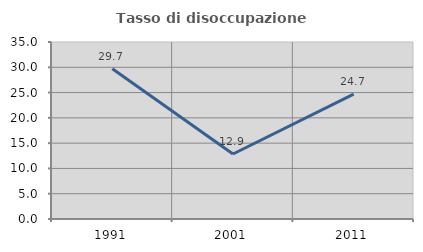
| Category | Tasso di disoccupazione giovanile  |
|---|---|
| 1991.0 | 29.719 |
| 2001.0 | 12.857 |
| 2011.0 | 24.699 |